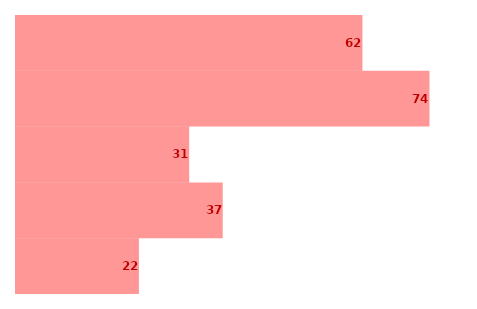
| Category | Series 0 |
|---|---|
| 0 | 22 |
| 1 | 37 |
| 2 | 31 |
| 3 | 74 |
| 4 | 62 |